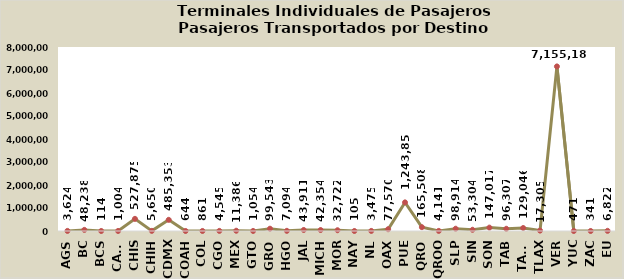
| Category | D e s t i n o s |
|---|---|
| AGS | 3624 |
| BC | 48238 |
| BCS | 114 |
| CAMP | 1004 |
| CHIS | 527875 |
| CHIH | 5650 |
| CDMX | 485353 |
| COAH | 644 |
| COL | 861 |
| CGO | 4545 |
| MEX | 11386 |
| GTO | 1054 |
| GRO | 99543 |
| HGO | 7094 |
| JAL | 43911 |
| MICH | 42354 |
| MOR | 32722 |
| NAY | 105 |
| NL | 3475 |
| OAX | 77570 |
| PUE | 1243850 |
| QRO | 165508 |
| QROO | 4141 |
| SLP | 98914 |
| SIN | 53304 |
| SON | 147017 |
| TAB | 96307 |
| TAMS | 129046 |
| TLAX | 17305 |
| VER | 7155182 |
| YUC | 471 |
| ZAC | 341 |
| EU | 6822 |